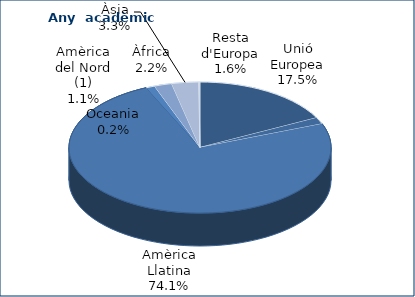
| Category | Series 0 |
|---|---|
| Unió Europea | 226 |
| Resta d'Europa | 21 |
| Amèrica Llatina | 958 |
| Amèrica del Nord (1) | 14 |
| Àfrica | 28 |
| Àsia | 43 |
| Oceania | 2 |